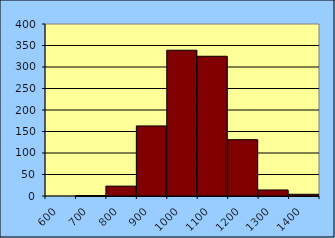
| Category | Series 0 |
|---|---|
| 600.0 | 0 |
| 700.0 | 1 |
| 800.0 | 23 |
| 900.0 | 163 |
| 1000.0 | 339 |
| 1100.0 | 325 |
| 1200.0 | 131 |
| 1300.0 | 14 |
| 1400.0 | 4 |